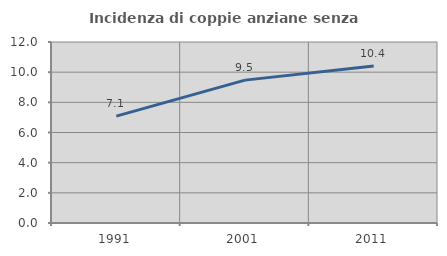
| Category | Incidenza di coppie anziane senza figli  |
|---|---|
| 1991.0 | 7.088 |
| 2001.0 | 9.472 |
| 2011.0 | 10.409 |